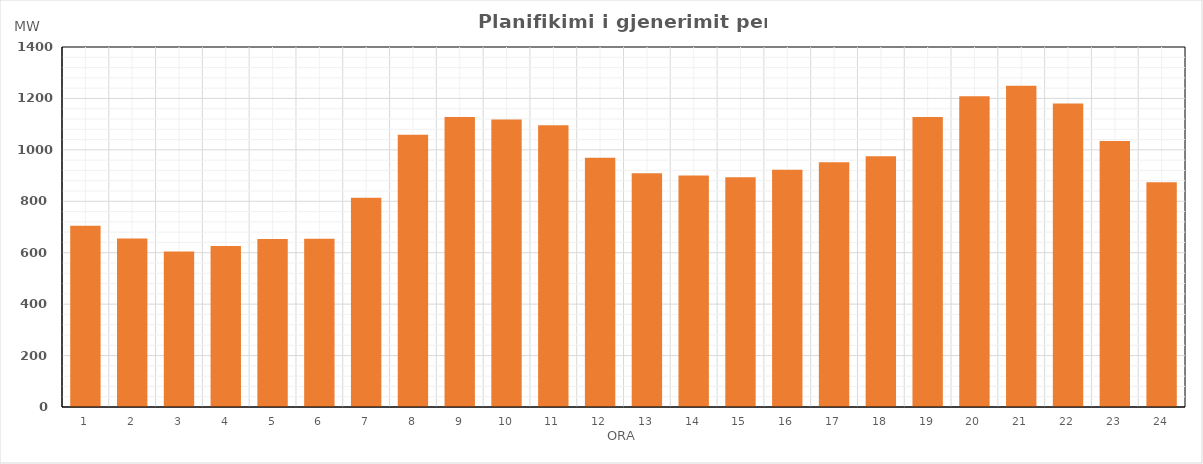
| Category | Max (MW) |
|---|---|
| 0 | 705.221 |
| 1 | 654.971 |
| 2 | 605.05 |
| 3 | 626.05 |
| 4 | 653.051 |
| 5 | 653.939 |
| 6 | 813.9 |
| 7 | 1059.075 |
| 8 | 1127.427 |
| 9 | 1117.583 |
| 10 | 1095.491 |
| 11 | 968.997 |
| 12 | 908.939 |
| 13 | 899.923 |
| 14 | 893.815 |
| 15 | 922.779 |
| 16 | 951.789 |
| 17 | 974.9 |
| 18 | 1128.02 |
| 19 | 1208.02 |
| 20 | 1249.02 |
| 21 | 1180.02 |
| 22 | 1034.9 |
| 23 | 873.555 |